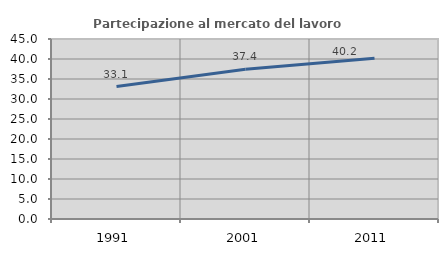
| Category | Partecipazione al mercato del lavoro  femminile |
|---|---|
| 1991.0 | 33.099 |
| 2001.0 | 37.415 |
| 2011.0 | 40.193 |